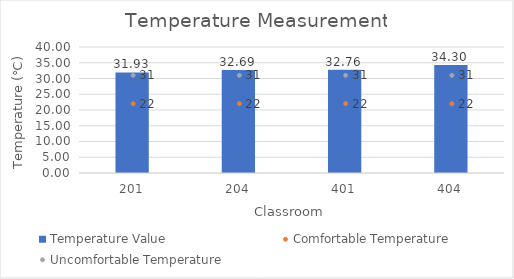
| Category | Temperature Value |
|---|---|
| 201.0 | 31.928 |
| 204.0 | 32.688 |
| 401.0 | 32.762 |
| 404.0 | 34.3 |